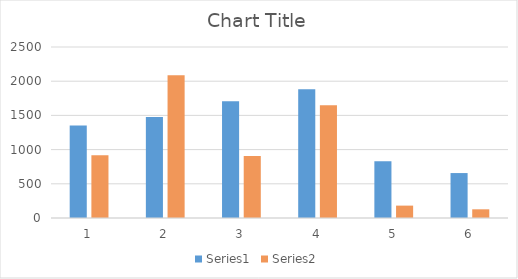
| Category | Series 0 | Series 2 | Series 3 | Series 4 | Series 5 | Series 6 | Series 7 | Series 8 | Series 9 | Series 10 | Series 11 | Series 12 | Series 13 |
|---|---|---|---|---|---|---|---|---|---|---|---|---|---|
| 0 | 1352 |  |  |  |  |  |  |  |  |  |  |  | 916 |
| 1 | 1478 |  |  |  |  |  |  |  |  |  |  |  | 2087 |
| 2 | 1706 |  |  |  |  |  |  |  |  |  |  |  | 906 |
| 3 | 1881 |  |  |  |  |  |  |  |  |  |  |  | 1648 |
| 4 | 831 |  |  |  |  |  |  |  |  |  |  |  | 181 |
| 5 | 657 |  |  |  |  |  |  |  |  |  |  |  | 127 |